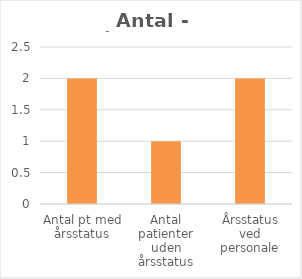
| Category | Series 0 |
|---|---|
| Antal pt med årsstatus | 2 |
| Antal patienter uden årsstatus | 1 |
| Årsstatus ved personale | 2 |